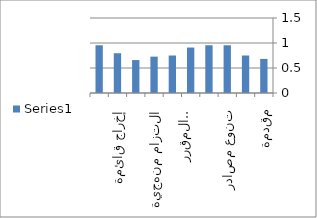
| Category | Series 0 |
|---|---|
| مقدمة | 0.682 |
| حداثة مراجع | 0.75 |
| تنوع مصادر | 0.955 |
| عدد مراجع | 0.955 |
| ارتباط بالمقرر | 0.909 |
| اكتمال معلومات | 0.75 |
| التزام منهجية | 0.727 |
| وصف مختصر | 0.659 |
| إخراج قائمة | 0.795 |
| موعد تسليم | 0.955 |